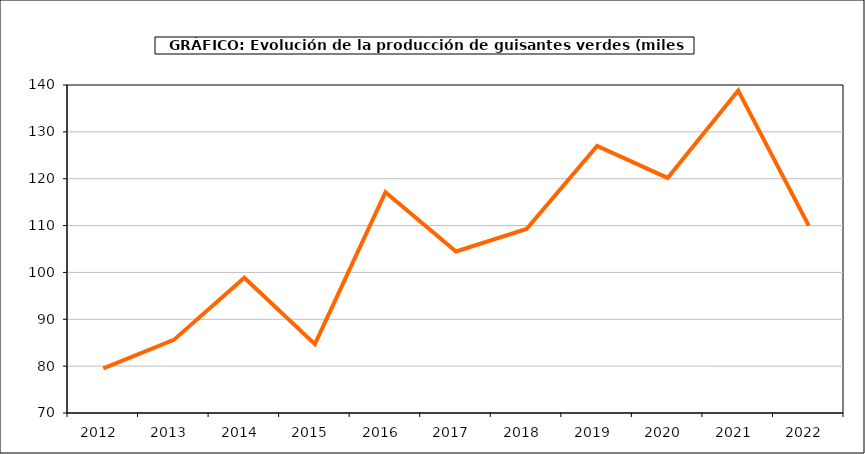
| Category | producción |
|---|---|
| 2012.0 | 79.511 |
| 2013.0 | 85.601 |
| 2014.0 | 98.878 |
| 2015.0 | 84.705 |
| 2016.0 | 117.126 |
| 2017.0 | 104.472 |
| 2018.0 | 109.27 |
| 2019.0 | 126.984 |
| 2020.0 | 120.165 |
| 2021.0 | 138.806 |
| 2022.0 | 109.978 |